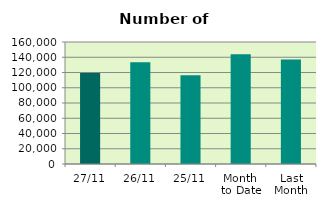
| Category | Series 0 |
|---|---|
| 27/11 | 119252 |
| 26/11 | 133540 |
| 25/11 | 116544 |
| Month 
to Date | 143848 |
| Last
Month | 137122.087 |